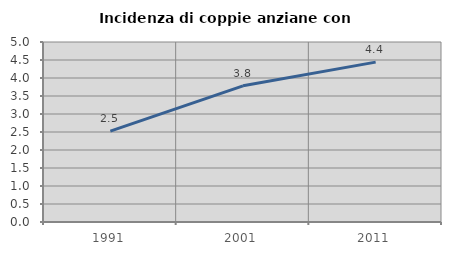
| Category | Incidenza di coppie anziane con figli |
|---|---|
| 1991.0 | 2.523 |
| 2001.0 | 3.782 |
| 2011.0 | 4.441 |